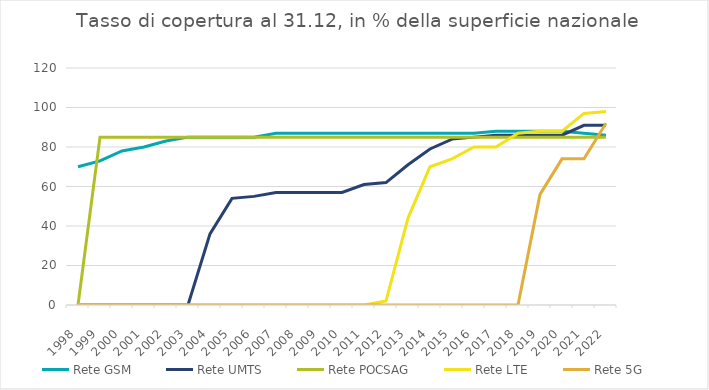
| Category | Rete GSM | Rete UMTS | Rete POCSAG | Rete LTE | Rete 5G |
|---|---|---|---|---|---|
| 1998.0 | 70 | 0 | 0 | 0 | 0 |
| 1999.0 | 73 | 0 | 85 | 0 | 0 |
| 2000.0 | 78 | 0 | 85 | 0 | 0 |
| 2001.0 | 80 | 0 | 85 | 0 | 0 |
| 2002.0 | 83 | 0 | 85 | 0 | 0 |
| 2003.0 | 85 | 0 | 85 | 0 | 0 |
| 2004.0 | 85 | 36 | 85 | 0 | 0 |
| 2005.0 | 85 | 54 | 85 | 0 | 0 |
| 2006.0 | 85 | 55 | 85 | 0 | 0 |
| 2007.0 | 87 | 57 | 85 | 0 | 0 |
| 2008.0 | 87 | 57 | 85 | 0 | 0 |
| 2009.0 | 87 | 57 | 85 | 0 | 0 |
| 2010.0 | 87 | 57 | 85 | 0 | 0 |
| 2011.0 | 87 | 61 | 85 | 0 | 0 |
| 2012.0 | 87 | 62 | 85 | 2 | 0 |
| 2013.0 | 87 | 71 | 85 | 44 | 0 |
| 2014.0 | 87 | 79 | 85 | 70 | 0 |
| 2015.0 | 87 | 84 | 85 | 74 | 0 |
| 2016.0 | 87 | 85 | 85 | 80 | 0 |
| 2017.0 | 88 | 86 | 85 | 80 | 0 |
| 2018.0 | 88 | 86 | 85 | 87 | 0 |
| 2019.0 | 88 | 86 | 85 | 88 | 56 |
| 2020.0 | 88 | 86 | 85 | 88 | 74 |
| 2021.0 | 87 | 91 | 85 | 97 | 74 |
| 2022.0 | 86 | 91 | 85 | 98 | 92 |